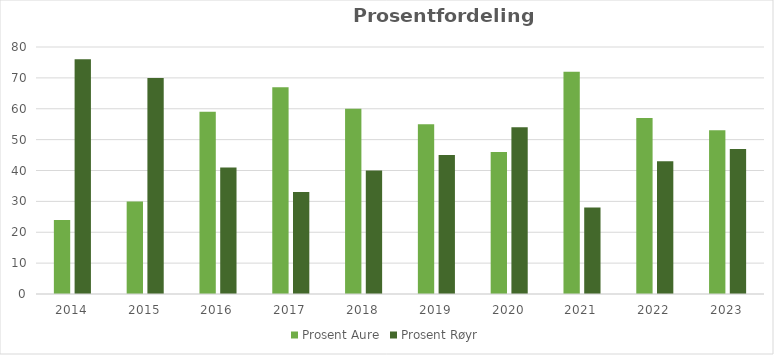
| Category | Prosent Aure | 31 | 69 | Prosent Røyr |
|---|---|---|---|---|
| 2014.0 | 24 |  |  | 76 |
| 2015.0 | 30 |  |  | 70 |
| 2016.0 | 59 |  |  | 41 |
| 2017.0 | 67 |  |  | 33 |
| 2018.0 | 60 |  |  | 40 |
| 2019.0 | 55 |  |  | 45 |
| 2020.0 | 46 |  |  | 54 |
| 2021.0 | 72 |  |  | 28 |
| 2022.0 | 57 |  |  | 43 |
| 2023.0 | 53 |  |  | 47 |